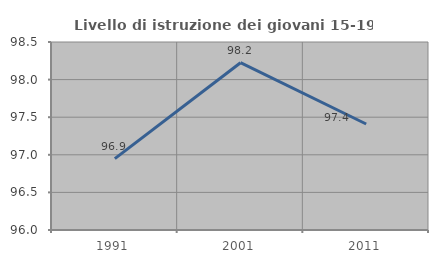
| Category | Livello di istruzione dei giovani 15-19 anni |
|---|---|
| 1991.0 | 96.949 |
| 2001.0 | 98.225 |
| 2011.0 | 97.409 |